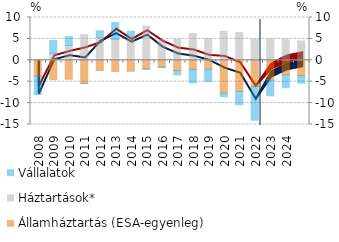
| Category | Államháztartás (ESA-egyenleg) | Háztartások* | Vállalatok |
|---|---|---|---|
| 2008.0 | -3.672 | 0.059 | -4.324 |
| 2009.0 | -4.521 | 1.63 | 3.005 |
| 2010.0 | -4.43 | 3.467 | 2.05 |
| 2011.0 | -5.368 | 5.977 | -0.052 |
| 2012.0 | -2.381 | 5.353 | 1.533 |
| 2013.0 | -2.611 | 4.941 | 3.894 |
| 2014.0 | -2.581 | 5.444 | 1.368 |
| 2015.0 | -2.003 | 7.994 | -0.09 |
| 2016.0 | -1.573 | 4.78 | -0.154 |
| 2017.0 | -2.428 | 4.895 | -0.997 |
| 2018.0 | -2.094 | 6.259 | -3.196 |
| 2019.0 | -2.078 | 5.026 | -2.887 |
| 2020.0 | -7.623 | 6.761 | -0.914 |
| 2021.0 | -7.254 | 6.485 | -3.142 |
| 2022.0 | -6.114 | 4.881 | -7.874 |
| 2023.0 | -4.633 | 4.973 | -3.662 |
| 2024.0 | -3.387 | 4.851 | -3.015 |
| 2025.0 | -3.557 | 4.504 | -1.772 |